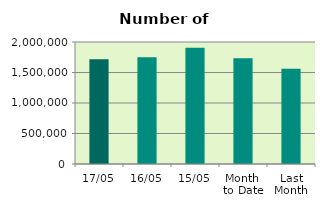
| Category | Series 0 |
|---|---|
| 17/05 | 1719118 |
| 16/05 | 1751882 |
| 15/05 | 1904626 |
| Month 
to Date | 1731790.333 |
| Last
Month | 1561575.6 |